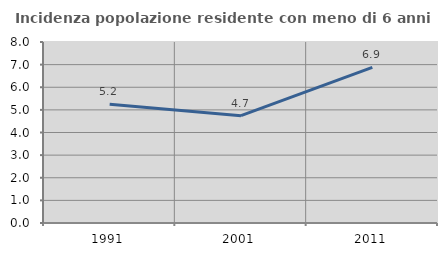
| Category | Incidenza popolazione residente con meno di 6 anni |
|---|---|
| 1991.0 | 5.247 |
| 2001.0 | 4.744 |
| 2011.0 | 6.881 |